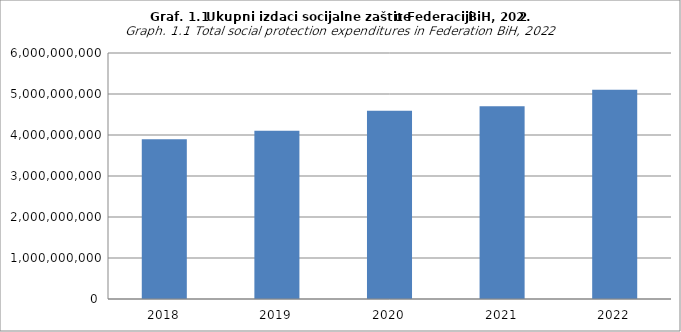
| Category | Ukupni izdaci socijalne zaštite  |
|---|---|
| 2018 | 3893455488 |
| 2019 | 4104612966 |
| 2020 | 4590725821 |
| 2021 | 4701111187 |
| 2022 | 5100826286 |